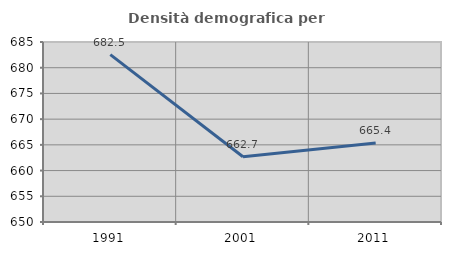
| Category | Densità demografica |
|---|---|
| 1991.0 | 682.549 |
| 2001.0 | 662.685 |
| 2011.0 | 665.359 |